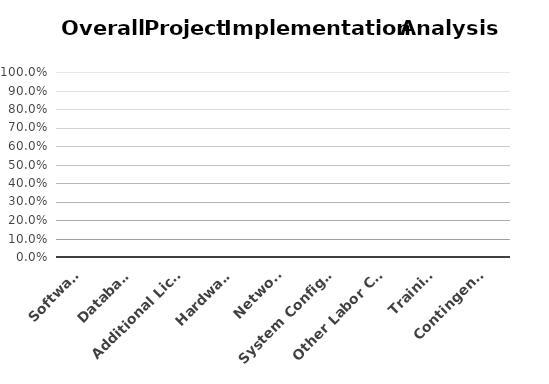
| Category | Series 0 |
|---|---|
| Software | 0 |
| Database | 0 |
| Additional Licenses | 0 |
| Hardware | 0 |
| Network | 0 |
| System Configuration | 0 |
| Other Labor Costs | 0 |
| Training | 0 |
| Contingency | 0 |